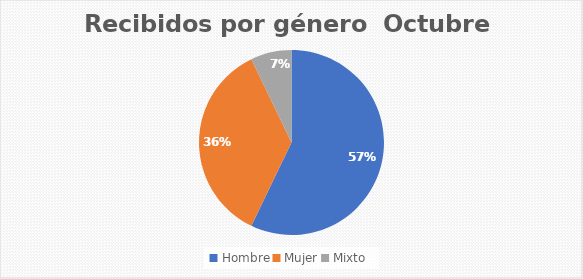
| Category | Recibidos por género  Cantidad |
|---|---|
| Hombre | 16 |
| Mujer | 10 |
| Mixto | 2 |